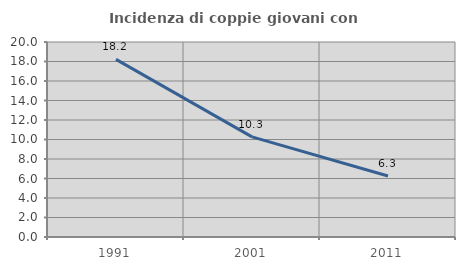
| Category | Incidenza di coppie giovani con figli |
|---|---|
| 1991.0 | 18.214 |
| 2001.0 | 10.266 |
| 2011.0 | 6.25 |